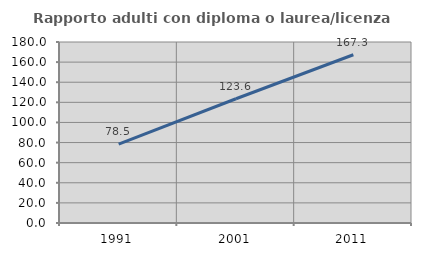
| Category | Rapporto adulti con diploma o laurea/licenza media  |
|---|---|
| 1991.0 | 78.465 |
| 2001.0 | 123.567 |
| 2011.0 | 167.317 |